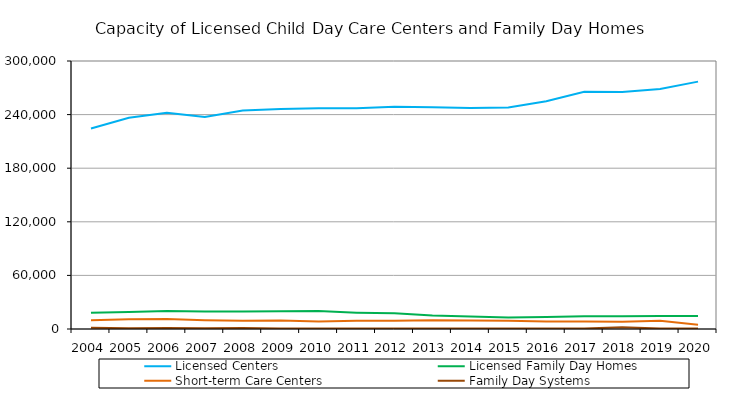
| Category | Licensed Centers | Licensed Family Day Homes | Short-term Care Centers | Family Day Systems |
|---|---|---|---|---|
| 2004 | 224458 | 18152 | 9917 | 1474 |
| 2005 | 236558 | 19043 | 10965 | 910 |
| 2006 | 242191 | 20105 | 11086 | 1036 |
| 2007 | 237215 | 19495 | 9824 | 960 |
| 2008 | 244689 | 19454 | 9128 | 1001 |
| 2009 | 246366 | 19829 | 9389 | 475 |
| 2010 | 246980 | 20071 | 8489 | 475 |
| 2011 | 247195 | 18319 | 9320 | 475 |
| 2012 | 248869 | 17504 | 9130 | 475 |
| 2013 | 248337 | 15071 | 9797 | 475 |
| 2014 | 247489 | 14042 | 9378 | 475 |
| 2015 | 248070 | 12829 | 9203 | 475 |
| 2016 | 254986 | 13530 | 8353 | 475 |
| 2017 | 265634 | 14272 | 8515 | 475 |
| 2018 | 265281 | 14345 | 8036 | 1900 |
| 2019 | 268678 | 14576 | 9312 | 475 |
| 2020 | 276896 | 14485 | 4653 | 475 |